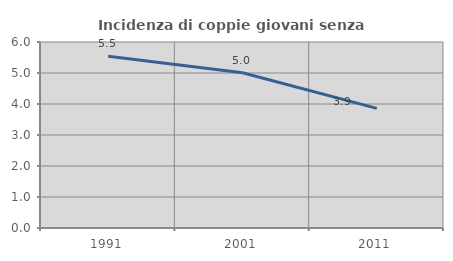
| Category | Incidenza di coppie giovani senza figli |
|---|---|
| 1991.0 | 5.542 |
| 2001.0 | 5.009 |
| 2011.0 | 3.859 |